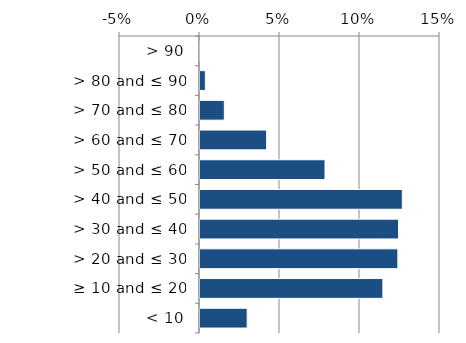
| Category | Non native |
|---|---|
|  < 10 | 0.03 |
|  ≥ 10 and ≤ 20 | 0.115 |
|  > 20 and ≤ 30 | 0.124 |
|  > 30 and ≤ 40 | 0.125 |
|  > 40 and ≤ 50 | 0.127 |
|  > 50 and ≤ 60 | 0.079 |
|  > 60 and ≤ 70 | 0.042 |
|  > 70 and ≤ 80 | 0.016 |
|  > 80 and ≤ 90 | 0.004 |
|  > 90 | 0 |